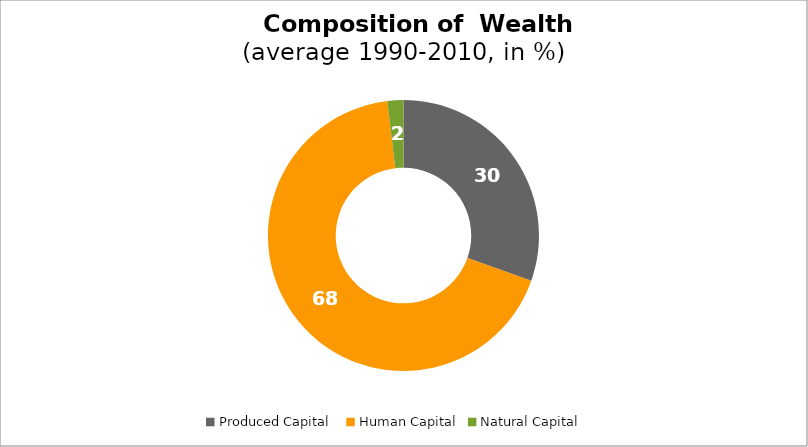
| Category | Series 0 |
|---|---|
| Produced Capital  | 30.404 |
| Human Capital | 67.676 |
| Natural Capital | 1.92 |